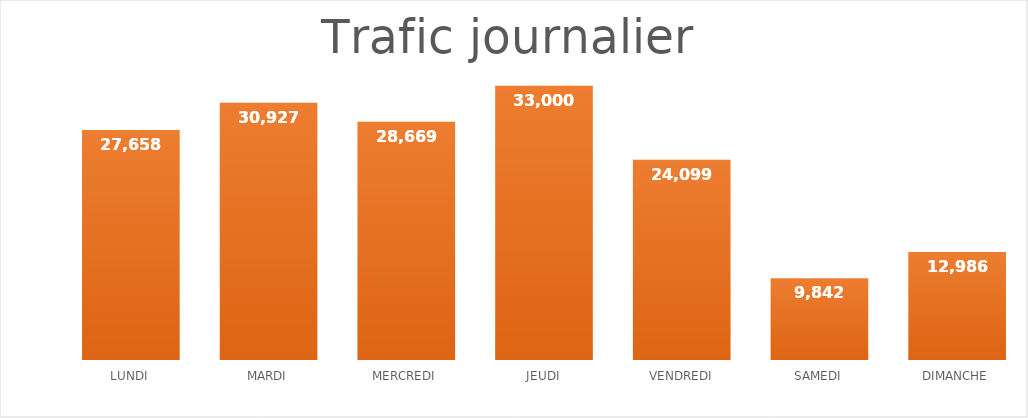
| Category | Series 0 |
|---|---|
| LUNDI | 27658 |
| MARDI | 30927 |
| MERCREDI | 28669 |
| JEUDI | 33000 |
| VENDREDI | 24099 |
| SAMEDI | 9842 |
| DIMANCHE | 12986 |